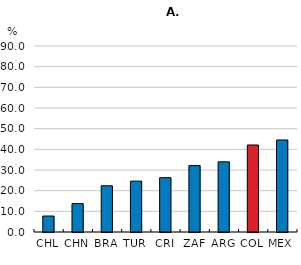
| Category | Employees |
|---|---|
| CHL | 7.728 |
| CHN | 13.732 |
| BRA | 22.356 |
| TUR | 24.614 |
| CRI | 26.288 |
| ZAF | 32.156 |
| ARG | 33.96 |
| COL | 42.092 |
| MEX | 44.526 |